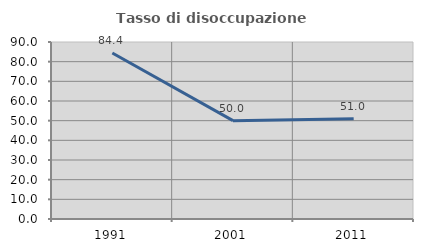
| Category | Tasso di disoccupazione giovanile  |
|---|---|
| 1991.0 | 84.397 |
| 2001.0 | 50 |
| 2011.0 | 50.98 |